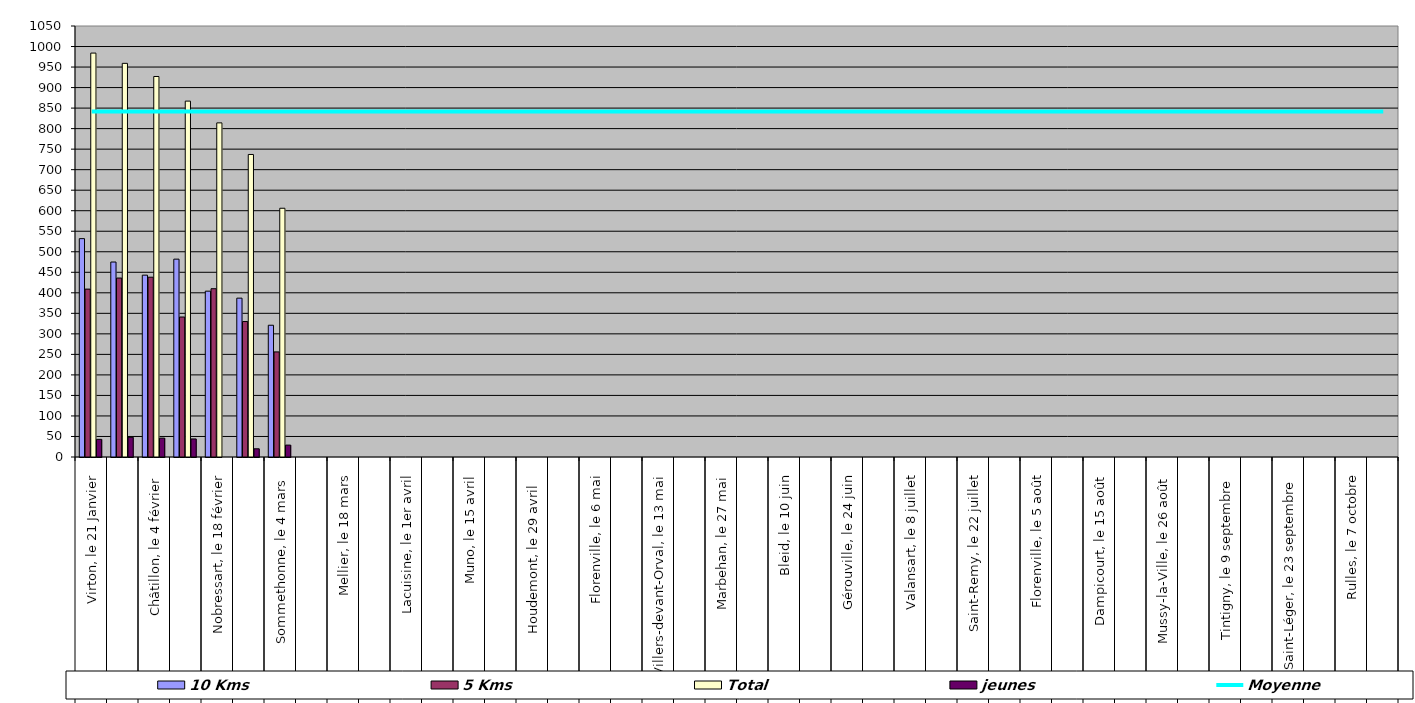
| Category | 10 Kms | 5 Kms | Total | jeunes |
|---|---|---|---|---|
| 0 | 532 | 409 | 984 | 43 |
| 1 | 475 | 436 | 959 | 48 |
| 2 | 443 | 438 | 927 | 46 |
| 3 | 482 | 341 | 867 | 44 |
| 4 | 404 | 410 | 814 | 0 |
| 5 | 387 | 330 | 737 | 20 |
| 6 | 321 | 256 | 606 | 29 |
| 7 | 0 | 0 | 0 | 0 |
| 8 | 0 | 0 | 0 | 0 |
| 9 | 0 | 0 | 0 | 0 |
| 10 | 0 | 0 | 0 | 0 |
| 11 | 0 | 0 | 0 | 0 |
| 12 | 0 | 0 | 0 | 0 |
| 13 | 0 | 0 | 0 | 0 |
| 14 | 0 | 0 | 0 | 0 |
| 15 | 0 | 0 | 0 | 0 |
| 16 | 0 | 0 | 0 | 0 |
| 17 | 0 | 0 | 0 | 0 |
| 18 | 0 | 0 | 0 | 0 |
| 19 | 0 | 0 | 0 | 0 |
| 20 | 0 | 0 | 0 | 0 |
| 21 | 0 | 0 | 0 | 0 |
| 22 | 0 | 0 | 0 | 0 |
| 23 | 0 | 0 | 0 | 0 |
| 24 | 0 | 0 | 0 | 0 |
| 25 | 0 | 0 | 0 | 0 |
| 26 | 0 | 0 | 0 | 0 |
| 27 | 0 | 0 | 0 | 0 |
| 28 | 0 | 0 | 0 | 0 |
| 29 | 0 | 0 | 0 | 0 |
| 30 | 0 | 0 | 0 | 0 |
| 31 | 0 | 0 | 0 | 0 |
| 32 | 0 | 0 | 0 | 0 |
| 33 | 0 | 0 | 0 | 0 |
| 34 | 0 | 0 | 0 | 0 |
| 35 | 0 | 0 | 0 | 0 |
| 36 | 0 | 0 | 0 | 0 |
| 37 | 0 | 0 | 0 | 0 |
| 38 | 0 | 0 | 0 | 0 |
| 39 | 0 | 0 | 0 | 0 |
| 40 | 0 | 0 | 0 | 0 |
| 41 | 0 | 0 | 0 | 0 |